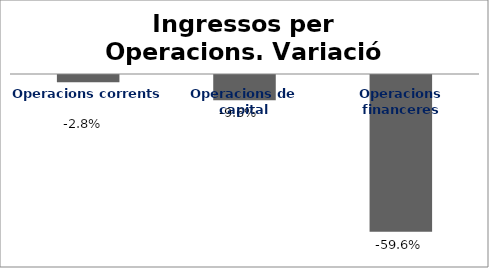
| Category | Series 0 |
|---|---|
| Operacions corrents | -0.028 |
| Operacions de capital | -0.096 |
| Operacions financeres | -0.596 |